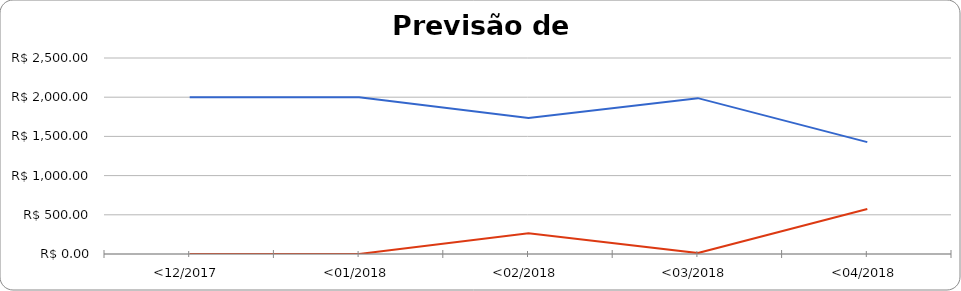
| Category | Series 0 | Series 1 |
|---|---|---|
| <12/2017 | 2000 | 0 |
| <01/2018 | 2000 | 0 |
| <02/2018 | 1735.65 | 264.35 |
| <03/2018 | 1988 | 12 |
| <04/2018 | 1426.67 | 573.33 |